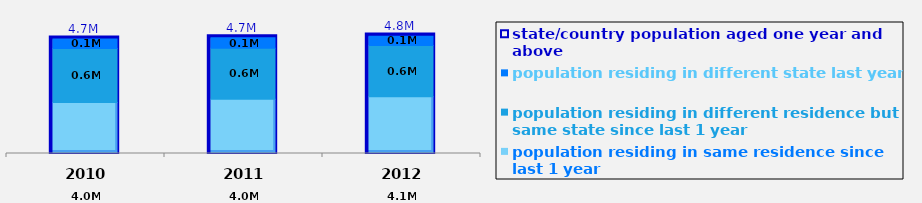
| Category | state/country population aged one year and above |
|---|---|
| 2010.0 | 4729509 |
| 2011.0 | 4745278 |
| 2012.0 | 4764428 |